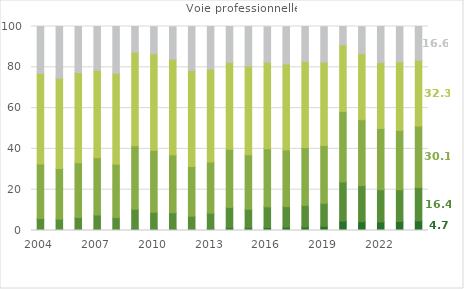
| Category | Très bien | Bien | Assez bien | Admis sans mention | Refusé |
|---|---|---|---|---|---|
| 2004 | 0.4 | 5.5 | 26.7 | 44.4 | 23 |
| 2005 | 0.4 | 5.2 | 24.8 | 44.3 | 25.3 |
| 2006 | 0.5 | 5.9 | 26.8 | 44.2 | 22.6 |
| 2007 | 0.6 | 7 | 28.1 | 42.9 | 21.5 |
| 2008 | 0.5 | 5.8 | 26.2 | 44.6 | 23 |
| 2009 | 0.9 | 9.5 | 31.1 | 45.9 | 12.6 |
| 2010 | 0.7 | 8.2 | 30.4 | 47.3 | 13.3 |
| 2011 | 0.7 | 8 | 28.4 | 46.9 | 15.9 |
| 2012 | 0.6 | 6.4 | 24.4 | 47.1 | 21.5 |
| 2013 | 0.9 | 7.6 | 25.1 | 45.4 | 21 |
| 2014 | 1.3 | 10 | 28.5 | 42.6 | 17.7 |
| 2015 | 1.3 | 9.1 | 26.7 | 43.5 | 19.4 |
| 2016 | 1.4 | 10.2 | 28.5 | 42.4 | 17.4 |
| 2017 | 1.6 | 10.1 | 27.8 | 42.1 | 18.3 |
| 2018 | 1.7 | 10.6 | 28.3 | 42.3 | 17.1 |
| 2019 | 2 | 11.3 | 28.4 | 40.8 | 17.4 |
| 2020 | 4.6 | 19.2 | 34.6 | 32.6 | 9.1 |
| 2021 | 4.3 | 17.7 | 32.3 | 32.4 | 13.2 |
| 2022 | 4.2 | 15.8 | 30 | 32.4 | 17.6 |
| 2023 | 4.4 | 15.6 | 29.1 | 33.6 | 17.2 |
| 2024p | 4.7 | 16.4 | 30.1 | 32.3 | 16.6 |